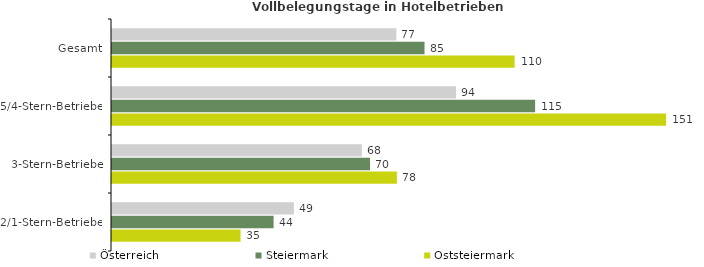
| Category | Österreich | Steiermark | Oststeiermark |
|---|---|---|---|
| Gesamt | 77.394 | 85.042 | 109.559 |
| 5/4-Stern-Betriebe | 93.608 | 115.133 | 150.774 |
| 3-Stern-Betriebe | 67.992 | 70.225 | 77.521 |
| 2/1-Stern-Betriebe | 49.488 | 43.973 | 34.976 |